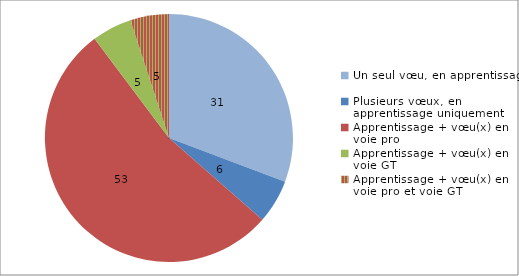
| Category | Series 0 |
|---|---|
| Un seul vœu, en apprentissage | 30.723 |
| Plusieurs vœux, en apprentissage uniquement | 5.72 |
| Apprentissage + vœu(x) en voie pro | 53.309 |
| Apprentissage + vœu(x) en voie GT | 5.208 |
| Apprentissage + vœu(x) en voie pro et voie GT | 5.039 |